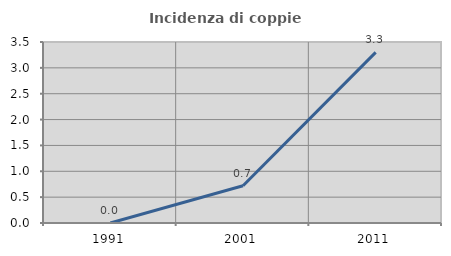
| Category | Incidenza di coppie miste |
|---|---|
| 1991.0 | 0 |
| 2001.0 | 0.719 |
| 2011.0 | 3.3 |